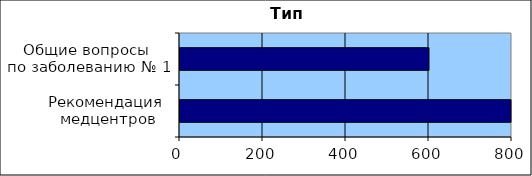
| Category | Series 0 |
|---|---|
| Рекомендация
 медцентров | 1000 |
| Общие вопросы 
по заболеванию № 1 | 600 |